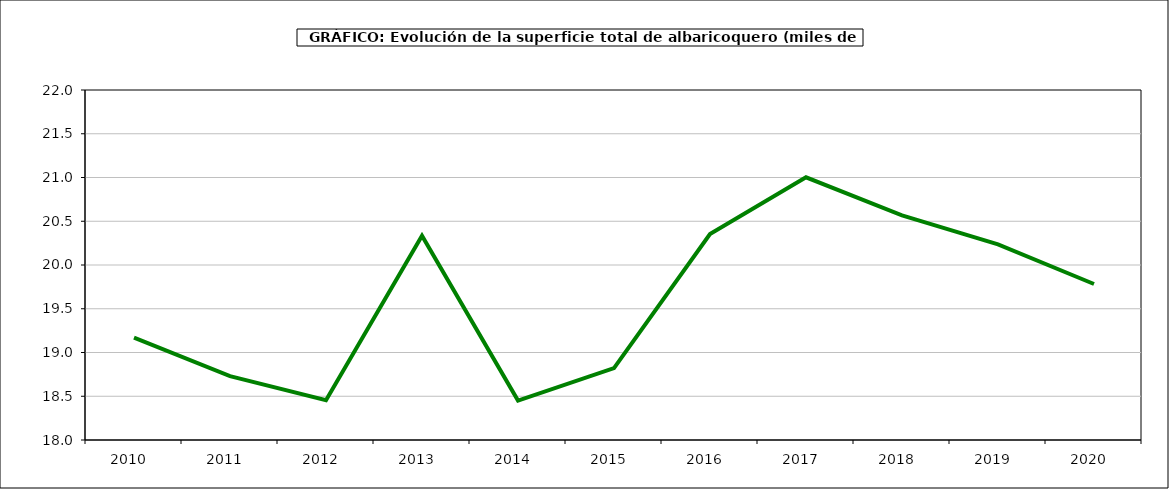
| Category | superficie albaricoquero |
|---|---|
| 2010.0 | 19.169 |
| 2011.0 | 18.729 |
| 2012.0 | 18.455 |
| 2013.0 | 20.334 |
| 2014.0 | 18.451 |
| 2015.0 | 18.822 |
| 2016.0 | 20.353 |
| 2017.0 | 21.002 |
| 2018.0 | 20.567 |
| 2019.0 | 20.235 |
| 2020.0 | 19.783 |